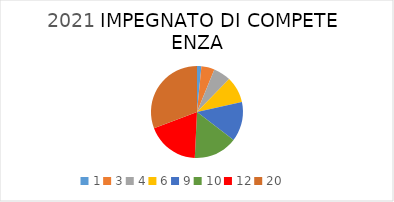
| Category | Series 0 | Series 1 |
|---|---|---|
| 1.0 | 1 | 237853.04 |
| 3.0 | 3 | 12444 |
| 4.0 | 4 | 255921.31 |
| 6.0 | 6 | 721090.02 |
| 9.0 | 9 | 39368.18 |
| 10.0 | 10 | 909310.67 |
| 12.0 | 12 | 45082.86 |
| 20.0 | 20 | 0 |